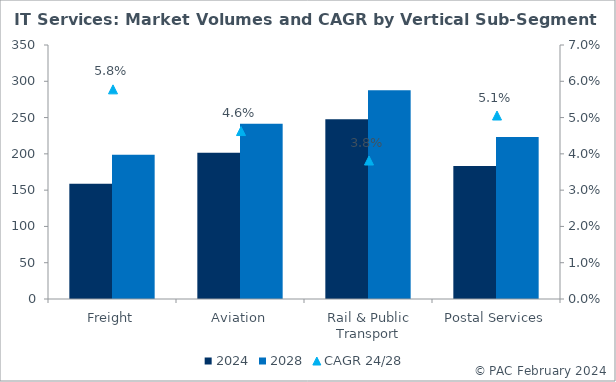
| Category | 2024 | 2028 |
|---|---|---|
| Freight | 158.787 | 198.787 |
| Aviation | 201.626 | 241.626 |
| Rail & Public Transport | 247.517 | 287.517 |
| Postal Services | 183.381 | 223.381 |